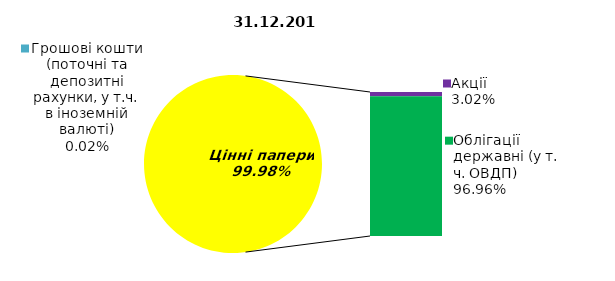
| Category | Series 0 |
|---|---|
| Грошові кошти (поточні та депозитні рахунки, у т.ч. в іноземній валюті) | 0.018 |
| Банківські метали | 0 |
| Нерухомість | 0 |
| Інші активи | 0 |
| Акції | 2.417 |
| Облігації підприємств | 0 |
| Муніципальні облігації | 0 |
| Облігації державні (у т. ч. ОВДП) | 77.574 |
| Іпотечні сертифікати | 0 |